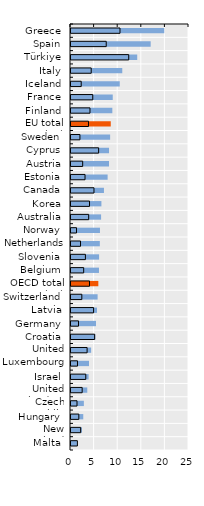
| Category | Foreign-born  | Native-born |
|---|---|---|
| Greece | 19.761 | 10.38 |
| Spain | 16.88 | 7.464 |
| Türkiye | 14.031 | 12.23 |
| Italy | 10.864 | 4.282 |
| Iceland | 10.33 | 2.163 |
| France | 8.845 | 4.611 |
| Finland | 8.757 | 4.02 |
| EU total (23) | 8.424 | 3.701 |
| Sweden | 8.29 | 1.893 |
| Cyprus | 8.056 | 5.855 |
| Austria | 8.052 | 2.474 |
| Estonia | 7.76 | 2.971 |
| Canada | 6.981 | 4.868 |
| Korea | 6.443 | 3.925 |
| Australia | 6.375 | 3.745 |
| Norway | 6.136 | 1.164 |
| Netherlands | 6.109 | 2.017 |
| Slovenia | 5.951 | 3.049 |
| Belgium | 5.926 | 2.685 |
| OECD total (29) | 5.79 | 3.919 |
| Switzerland | 5.639 | 2.292 |
| Latvia | 5.513 | 4.785 |
| Germany | 5.297 | 1.588 |
| Croatia | 5.156 | 5.012 |
| United States | 4.27 | 3.41 |
| Luxembourg | 3.817 | 1.371 |
| Israel | 3.73 | 3.13 |
| United Kingdom | 3.449 | 2.366 |
| Czech Republic | 2.724 | 1.274 |
| Hungary | 2.598 | 1.658 |
| New Zealand | 2.32 | 2.048 |
| Malta | 1.291 | 1.355 |